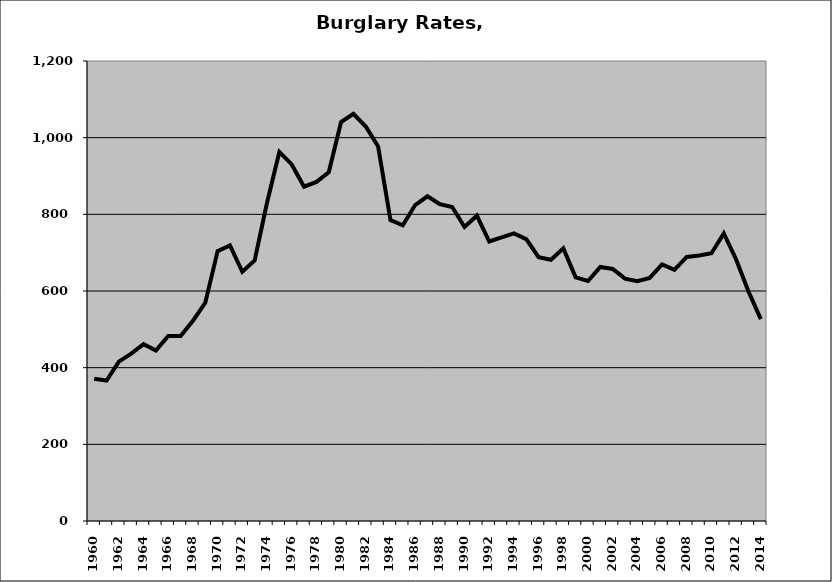
| Category | Burglary |
|---|---|
| 1960.0 | 371.08 |
| 1961.0 | 366.417 |
| 1962.0 | 415.607 |
| 1963.0 | 436.446 |
| 1964.0 | 461.254 |
| 1965.0 | 444.794 |
| 1966.0 | 482.564 |
| 1967.0 | 482.879 |
| 1968.0 | 522.515 |
| 1969.0 | 569.276 |
| 1970.0 | 703.939 |
| 1971.0 | 718.952 |
| 1972.0 | 650.167 |
| 1973.0 | 679.713 |
| 1974.0 | 830.057 |
| 1975.0 | 962.78 |
| 1976.0 | 930.163 |
| 1977.0 | 872.238 |
| 1978.0 | 884.563 |
| 1979.0 | 909.612 |
| 1980.0 | 1040.813 |
| 1981.0 | 1062.36 |
| 1982.0 | 1029.07 |
| 1983.0 | 977.006 |
| 1984.0 | 785.227 |
| 1985.0 | 771.31 |
| 1986.0 | 824.168 |
| 1987.0 | 847.089 |
| 1988.0 | 826.31 |
| 1989.0 | 819.05 |
| 1990.0 | 766.94 |
| 1991.0 | 796.553 |
| 1992.0 | 729.108 |
| 1993.0 | 740.063 |
| 1994.0 | 750.405 |
| 1995.0 | 735.466 |
| 1996.0 | 688.363 |
| 1997.0 | 681.627 |
| 1998.0 | 711.331 |
| 1999.0 | 635.726 |
| 2000.0 | 626.161 |
| 2001.0 | 662.699 |
| 2002.0 | 657.51 |
| 2003.0 | 632.171 |
| 2004.0 | 625.375 |
| 2005.0 | 634.088 |
| 2006.0 | 669.556 |
| 2007.0 | 655.315 |
| 2008.0 | 688.794 |
| 2009.0 | 692.611 |
| 2010.0 | 698.512 |
| 2011.0 | 749.975 |
| 2012.0 | 682.165 |
| 2013.0 | 598.489 |
| 2014.0 | 526.662 |